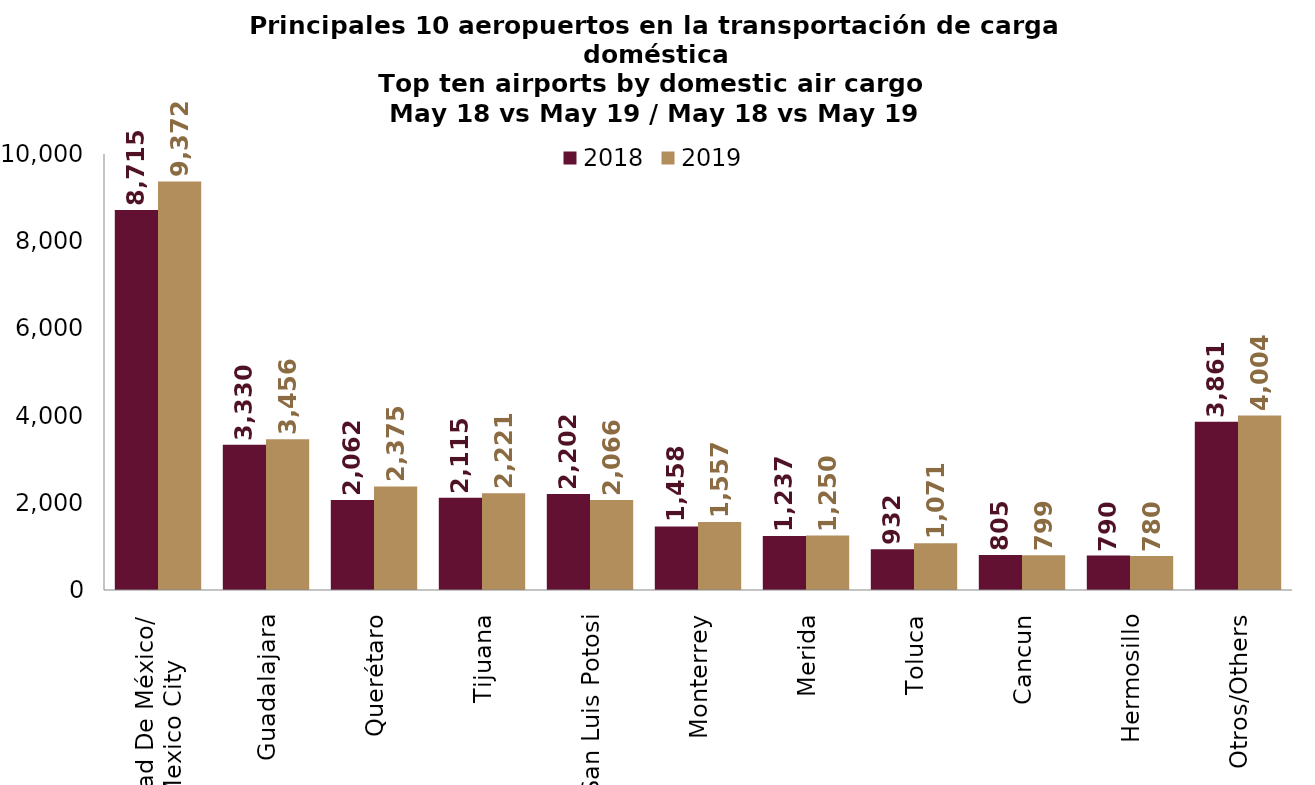
| Category | 2018 | 2019 |
|---|---|---|
| Ciudad De México/
Mexico City | 8715.01 | 9371.84 |
| Guadalajara | 3329.745 | 3455.835 |
| Querétaro | 2062.086 | 2374.794 |
| Tijuana | 2115.42 | 2221.305 |
| San Luis Potosi | 2202.145 | 2065.66 |
| Monterrey | 1457.558 | 1557.341 |
| Merida | 1236.702 | 1249.644 |
| Toluca | 932.211 | 1070.505 |
| Cancun | 805.065 | 798.891 |
| Hermosillo | 789.691 | 780.121 |
| Otros/Others | 3860.943 | 4004.109 |